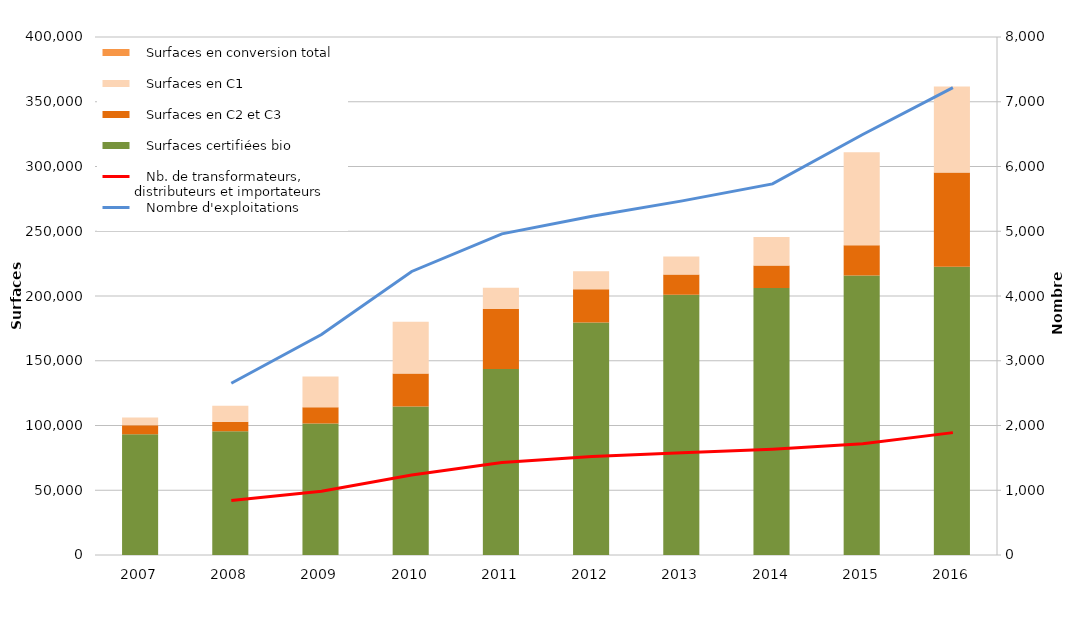
| Category |    Surfaces certifiées bio |    Surfaces en C2 et C3 |    Surfaces en C1 |    Surfaces en conversion total |
|---|---|---|---|---|
| 2007.0 | 93229.183 | 7026.628 | 5856.688 |  |
| 2008.0 | 95543.763 | 7361.532 | 12429.402 |  |
| 2009.0 | 101460.749 | 12616.579 | 23819.698 |  |
| 2010.0 | 114712.924 | 25479.926 | 39830.394 |  |
| 2011.0 | 143568.516 | 46455.607 | 16298.051 |  |
| 2012.0 | 179444.357 | 25713.997 | 13894.805 |  |
| 2013.0 | 200957.99 | 15686.929 | 13857.719 |  |
| 2014.0 | 206183.205 | 17447.659 | 21967.161 |  |
| 2015.0 | 215899.685 | 23216.159 | 71869.647 |  |
| 2016.0 | 222682.251 | 72677.271 | 66358.898 |  |